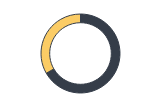
| Category | Series 0 |
|---|---|
| Verificação | 2 |
| Ajuste | 1 |